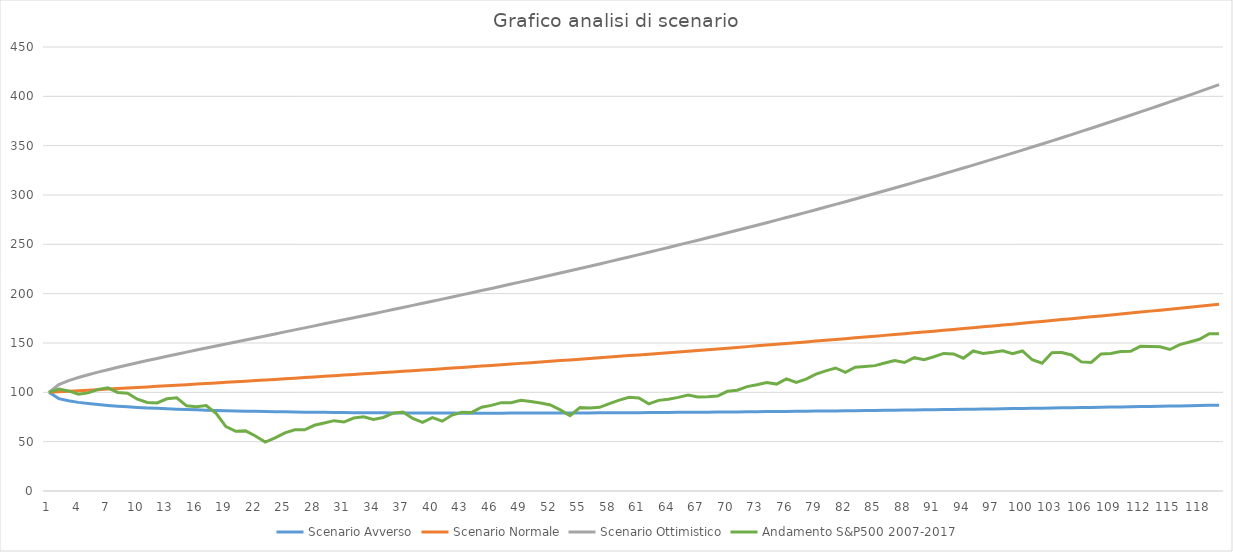
| Category | Scenario Avverso | Scenario Normale | Scenario Ottimistico | Andamento S&P500 2007-2017 |
|---|---|---|---|---|
| 0 | 100 | 100 | 100 | 100 |
| 1 | 93.622 | 100.538 | 107.964 | 103.25 |
| 2 | 91.387 | 101.078 | 111.796 | 101.412 |
| 3 | 89.821 | 101.621 | 114.972 | 98.167 |
| 4 | 88.596 | 102.168 | 117.819 | 99.433 |
| 5 | 87.586 | 102.717 | 120.462 | 102.993 |
| 6 | 86.728 | 103.269 | 122.966 | 104.517 |
| 7 | 85.983 | 103.824 | 125.368 | 99.919 |
| 8 | 85.327 | 104.383 | 127.694 | 99.059 |
| 9 | 84.743 | 104.944 | 129.96 | 92.997 |
| 10 | 84.219 | 105.508 | 132.178 | 89.761 |
| 11 | 83.746 | 106.075 | 134.358 | 89.222 |
| 12 | 83.315 | 106.645 | 136.508 | 93.46 |
| 13 | 82.923 | 107.219 | 138.632 | 94.46 |
| 14 | 82.564 | 107.795 | 140.736 | 86.336 |
| 15 | 82.235 | 108.375 | 142.823 | 85.482 |
| 16 | 81.932 | 108.957 | 144.897 | 86.525 |
| 17 | 81.653 | 109.543 | 146.959 | 78.668 |
| 18 | 81.396 | 110.132 | 149.013 | 65.342 |
| 19 | 81.158 | 110.724 | 151.061 | 60.454 |
| 20 | 80.938 | 111.319 | 153.104 | 60.926 |
| 21 | 80.736 | 111.918 | 155.143 | 55.704 |
| 22 | 80.548 | 112.519 | 157.18 | 49.583 |
| 23 | 80.375 | 113.124 | 159.217 | 53.817 |
| 24 | 80.215 | 113.732 | 161.254 | 58.87 |
| 25 | 80.068 | 114.344 | 163.292 | 61.996 |
| 26 | 79.932 | 114.958 | 165.333 | 62.009 |
| 27 | 79.808 | 115.576 | 167.376 | 66.604 |
| 28 | 79.693 | 116.198 | 169.423 | 68.841 |
| 29 | 79.589 | 116.822 | 171.475 | 71.299 |
| 30 | 79.493 | 117.45 | 173.532 | 69.887 |
| 31 | 79.407 | 118.082 | 175.594 | 73.899 |
| 32 | 79.328 | 118.717 | 177.662 | 75.214 |
| 33 | 79.258 | 119.355 | 179.737 | 72.431 |
| 34 | 79.195 | 119.997 | 181.819 | 74.496 |
| 35 | 79.139 | 120.642 | 183.909 | 78.876 |
| 36 | 79.09 | 121.29 | 186.007 | 80.043 |
| 37 | 79.048 | 121.942 | 188.113 | 73.48 |
| 38 | 79.011 | 122.598 | 190.228 | 69.519 |
| 39 | 78.981 | 123.257 | 192.353 | 74.302 |
| 40 | 78.957 | 123.92 | 194.486 | 70.78 |
| 41 | 78.938 | 124.586 | 196.63 | 76.981 |
| 42 | 78.925 | 125.255 | 198.783 | 79.821 |
| 43 | 78.917 | 125.929 | 200.947 | 79.638 |
| 44 | 78.913 | 126.606 | 203.122 | 84.838 |
| 45 | 78.915 | 127.286 | 205.308 | 86.755 |
| 46 | 78.921 | 127.971 | 207.505 | 89.531 |
| 47 | 78.932 | 128.659 | 209.713 | 89.442 |
| 48 | 78.947 | 129.35 | 211.934 | 91.991 |
| 49 | 78.966 | 130.046 | 214.166 | 90.749 |
| 50 | 78.99 | 130.745 | 216.411 | 89.088 |
| 51 | 79.017 | 131.448 | 218.668 | 87.173 |
| 52 | 79.048 | 132.154 | 220.938 | 82.222 |
| 53 | 79.084 | 132.865 | 223.221 | 76.318 |
| 54 | 79.122 | 133.579 | 225.517 | 84.537 |
| 55 | 79.165 | 134.297 | 227.826 | 84.106 |
| 56 | 79.21 | 135.019 | 230.149 | 84.821 |
| 57 | 79.26 | 135.745 | 232.486 | 88.519 |
| 58 | 79.312 | 136.475 | 234.837 | 92.113 |
| 59 | 79.368 | 137.209 | 237.201 | 94.996 |
| 60 | 79.427 | 137.946 | 239.581 | 94.284 |
| 61 | 79.489 | 138.688 | 241.975 | 88.372 |
| 62 | 79.554 | 139.433 | 244.384 | 91.872 |
| 63 | 79.622 | 140.183 | 246.807 | 93.03 |
| 64 | 79.693 | 140.937 | 249.246 | 94.872 |
| 65 | 79.766 | 141.694 | 251.7 | 97.167 |
| 66 | 79.843 | 142.456 | 254.17 | 95.244 |
| 67 | 79.922 | 143.222 | 256.656 | 95.51 |
| 68 | 80.004 | 143.992 | 259.157 | 96.188 |
| 69 | 80.089 | 144.766 | 261.674 | 101.036 |
| 70 | 80.176 | 145.544 | 264.208 | 102.158 |
| 71 | 80.265 | 146.327 | 266.758 | 105.835 |
| 72 | 80.358 | 147.113 | 269.325 | 107.751 |
| 73 | 80.452 | 147.904 | 271.908 | 109.992 |
| 74 | 80.549 | 148.699 | 274.509 | 108.342 |
| 75 | 80.649 | 149.499 | 277.126 | 113.705 |
| 76 | 80.75 | 150.302 | 279.761 | 110.146 |
| 77 | 80.854 | 151.11 | 282.413 | 113.418 |
| 78 | 80.961 | 151.923 | 285.083 | 118.476 |
| 79 | 81.069 | 152.739 | 287.77 | 121.793 |
| 80 | 81.18 | 153.56 | 290.476 | 124.668 |
| 81 | 81.293 | 154.386 | 293.2 | 120.23 |
| 82 | 81.408 | 155.216 | 295.942 | 125.411 |
| 83 | 81.525 | 156.05 | 298.702 | 126.277 |
| 84 | 81.644 | 156.889 | 301.481 | 127.06 |
| 85 | 81.766 | 157.733 | 304.279 | 129.728 |
| 86 | 81.889 | 158.581 | 307.096 | 132.206 |
| 87 | 82.014 | 159.433 | 309.933 | 130.209 |
| 88 | 82.142 | 160.29 | 312.788 | 135.118 |
| 89 | 82.271 | 161.152 | 315.663 | 133.024 |
| 90 | 82.403 | 162.018 | 318.558 | 136.11 |
| 91 | 82.536 | 162.889 | 321.472 | 139.445 |
| 92 | 82.671 | 163.765 | 324.406 | 138.859 |
| 93 | 82.808 | 164.646 | 327.361 | 134.555 |
| 94 | 82.947 | 165.531 | 330.336 | 141.942 |
| 95 | 83.088 | 166.421 | 333.331 | 139.472 |
| 96 | 83.23 | 167.315 | 336.348 | 140.657 |
| 97 | 83.375 | 168.215 | 339.385 | 142.134 |
| 98 | 83.521 | 169.119 | 342.443 | 139.149 |
| 99 | 83.669 | 170.028 | 345.522 | 141.891 |
| 100 | 83.819 | 170.942 | 348.623 | 133.008 |
| 101 | 83.971 | 171.861 | 351.745 | 129.497 |
| 102 | 84.124 | 172.785 | 354.889 | 140.245 |
| 103 | 84.279 | 173.714 | 358.055 | 140.315 |
| 104 | 84.436 | 174.648 | 361.243 | 137.86 |
| 105 | 84.595 | 175.587 | 364.453 | 130.87 |
| 106 | 84.755 | 176.531 | 367.686 | 130.334 |
| 107 | 84.917 | 177.48 | 370.941 | 138.936 |
| 108 | 85.08 | 178.434 | 374.219 | 139.311 |
| 109 | 85.246 | 179.393 | 377.52 | 141.442 |
| 110 | 85.412 | 180.358 | 380.844 | 141.57 |
| 111 | 85.581 | 181.327 | 384.192 | 146.609 |
| 112 | 85.751 | 182.302 | 387.563 | 146.434 |
| 113 | 85.923 | 183.282 | 390.957 | 146.258 |
| 114 | 86.097 | 184.267 | 394.376 | 143.42 |
| 115 | 86.272 | 185.258 | 397.819 | 148.325 |
| 116 | 86.448 | 186.254 | 401.286 | 151.025 |
| 117 | 86.627 | 187.255 | 404.777 | 153.728 |
| 118 | 86.807 | 188.262 | 408.293 | 159.447 |
| 119 | 86.988 | 189.274 | 411.834 | 159.383 |